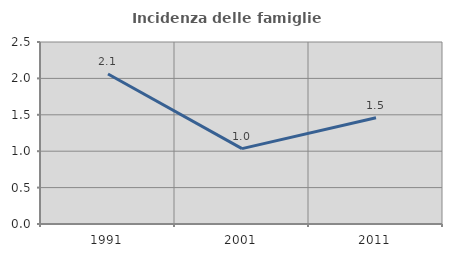
| Category | Incidenza delle famiglie numerose |
|---|---|
| 1991.0 | 2.061 |
| 2001.0 | 1.036 |
| 2011.0 | 1.459 |